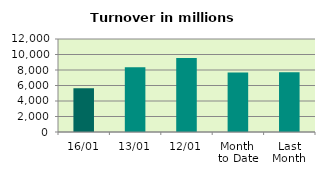
| Category | Series 0 |
|---|---|
| 16/01 | 5630.586 |
| 13/01 | 8345.425 |
| 12/01 | 9546.528 |
| Month 
to Date | 7686.836 |
| Last
Month | 7707.734 |